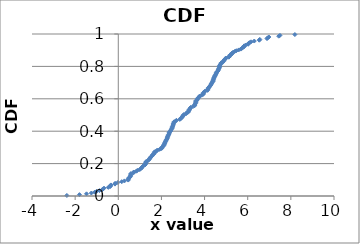
| Category | Series 0 |
|---|---|
| 2.92116049671744 | 0.483 |
| 4.691069828293452 | 0.797 |
| 3.863768191649954 | 0.622 |
| 0.5567508036521236 | 0.118 |
| 4.273871467133709 | 0.682 |
| 2.150887501739766 | 0.323 |
| 4.165580808899719 | 0.662 |
| 2.1759806109620103 | 0.333 |
| 0.584248065636312 | 0.138 |
| 4.663427167355252 | 0.787 |
| 1.13932823841632 | 0.183 |
| 5.582208659082646 | 0.902 |
| 4.966402476722099 | 0.847 |
| 2.5070611897885073 | 0.428 |
| 4.6364468851873095 | 0.777 |
| 2.9798841299689562 | 0.493 |
| 0.5652770093460227 | 0.123 |
| 5.831170378756515 | 0.922 |
| 3.933393813289146 | 0.627 |
| 2.024169018489188 | 0.298 |
| 3.3160073949156876 | 0.537 |
| 5.833778218197992 | 0.927 |
| 3.278588023149046 | 0.527 |
| 5.191456745703304 | 0.872 |
| 1.0379192066807637 | 0.168 |
| 3.240497186148671 | 0.517 |
| 4.510581693709724 | 0.747 |
| 4.5746018217126805 | 0.767 |
| 2.195615193063193 | 0.338 |
| 2.1508908211732214 | 0.328 |
| 6.021421844783063 | 0.937 |
| 6.894848530245525 | 0.972 |
| 2.257755373104324 | 0.353 |
| 0.5836269199614215 | 0.133 |
| -0.14706087765786524 | 0.078 |
| 7.438095384143731 | 0.987 |
| 1.099155956310656 | 0.178 |
| -1.4721609159649667 | 0.013 |
| 1.0830511653679809 | 0.173 |
| 1.2567259820370267 | 0.198 |
| 2.9004865230453065 | 0.478 |
| 3.546072103149542 | 0.562 |
| 1.4455250602531127 | 0.228 |
| 2.087307044682789 | 0.308 |
| 1.6306636417811862 | 0.258 |
| 0.7164946931124785 | 0.148 |
| 3.139100779745818 | 0.507 |
| 3.7757341126813646 | 0.617 |
| 2.2116057600804298 | 0.343 |
| 0.4669297893565316 | 0.103 |
| 0.4755541206145626 | 0.108 |
| 2.2760202060403385 | 0.358 |
| 5.13380779234312 | 0.862 |
| 2.359205979275716 | 0.388 |
| 1.176229760470223 | 0.188 |
| 6.928469794583378 | 0.977 |
| 5.12443700495685 | 0.857 |
| 6.1535315348412105 | 0.952 |
| 3.5913252318110622 | 0.577 |
| 4.770810319080422 | 0.822 |
| 4.2199886468724745 | 0.672 |
| 1.4877126364616697 | 0.238 |
| 1.4662808664144609 | 0.233 |
| 2.4922237811954147 | 0.418 |
| 2.6951878754889393 | 0.468 |
| 2.3123086392213326 | 0.373 |
| -0.35982464877750786 | 0.063 |
| 1.2701922619285848 | 0.203 |
| 6.031034142668977 | 0.942 |
| 0.49690587242163264 | 0.113 |
| 5.903558962852384 | 0.932 |
| 3.5395570305947888 | 0.557 |
| 4.13865468916983 | 0.652 |
| -0.020648072182097188 | 0.083 |
| -1.7998359549250047 | 0.008 |
| 4.4693887548417575 | 0.737 |
| 1.5784021216466093 | 0.253 |
| 4.545131422372471 | 0.757 |
| 2.5813292907676786 | 0.453 |
| 2.555658438847605 | 0.448 |
| 1.2930574234912262 | 0.213 |
| -0.3436070738769388 | 0.068 |
| 4.405155207712659 | 0.717 |
| 4.987031010464293 | 0.852 |
| 3.654631502388395 | 0.592 |
| 3.3596295826415723 | 0.547 |
| 4.23601105947577 | 0.677 |
| 4.415700945695866 | 0.722 |
| 4.547220291052788 | 0.762 |
| 0.4604912926768092 | 0.098 |
| 4.517294694822362 | 0.752 |
| 2.433168957647754 | 0.403 |
| 1.574299307301391 | 0.248 |
| 4.473301741591794 | 0.742 |
| 1.7796305957247052 | 0.278 |
| 3.7088794474267814 | 0.607 |
| 3.2441254621836255 | 0.522 |
| 4.352061565960882 | 0.702 |
| 2.6571600057443785 | 0.463 |
| -2.383727859050225 | 0.003 |
| 2.1171324881772806 | 0.318 |
| 4.75758710088852 | 0.817 |
| -0.7051528609320226 | 0.043 |
| 1.5258669742967315 | 0.243 |
| 0.9960985632590935 | 0.163 |
| 2.3252579080932003 | 0.378 |
| 4.018160433147798 | 0.647 |
| 4.686915741542183 | 0.792 |
| 5.392001084014566 | 0.892 |
| 3.9356716611333944 | 0.632 |
| 4.429839988994797 | 0.727 |
| 2.2926198299336806 | 0.368 |
| 2.5016749251269967 | 0.423 |
| 4.392783547001818 | 0.712 |
| -1.2475852086694506 | 0.018 |
| 1.2742537800050862 | 0.208 |
| 2.582291506563778 | 0.458 |
| 6.560734713391549 | 0.967 |
| 4.882909757493346 | 0.837 |
| 4.3103047849274745 | 0.692 |
| 5.6767152404681696 | 0.907 |
| 2.2327280076308593 | 0.348 |
| 3.1630642202273465 | 0.512 |
| 6.982246817684809 | 0.982 |
| 6.304234455710617 | 0.957 |
| 3.553620951846626 | 0.567 |
| 0.8830154724554564 | 0.158 |
| 3.994440142103867 | 0.642 |
| -1.094880546093222 | 0.023 |
| -0.8737704004936608 | 0.033 |
| 1.6698212496759033 | 0.263 |
| 2.541315794524186 | 0.438 |
| 4.298544686389936 | 0.687 |
| -0.46120078061029 | 0.053 |
| 3.462321238767192 | 0.552 |
| 4.695687036261823 | 0.802 |
| 5.315700755018115 | 0.887 |
| 5.270157060098232 | 0.882 |
| 4.438033928839825 | 0.732 |
| 3.664203784031213 | 0.597 |
| 3.69118842914195 | 0.602 |
| 4.625682695977932 | 0.772 |
| 0.2867695056665065 | 0.093 |
| 4.697131465410832 | 0.807 |
| 2.553221428130547 | 0.443 |
| 1.2526921656023955 | 0.193 |
| 4.639516269720099 | 0.782 |
| 4.389760286091116 | 0.707 |
| 3.5935086859452317 | 0.582 |
| 2.35646011178296 | 0.383 |
| 8.186361752899545 | 0.997 |
| 5.472899846149413 | 0.897 |
| 2.1132910182222107 | 0.313 |
| 3.5946452840347787 | 0.587 |
| 2.8518280306145543 | 0.473 |
| 5.727861055281268 | 0.912 |
| 0.8390154420698979 | 0.153 |
| 4.880875939764219 | 0.832 |
| -1.011742227155926 | 0.028 |
| 5.7765664484790324 | 0.917 |
| 3.5807862912704405 | 0.572 |
| 2.0342997910967564 | 0.303 |
| 1.9151395531072914 | 0.288 |
| 3.2790005170098 | 0.532 |
| 5.1875397742266305 | 0.867 |
| 3.9441288293111194 | 0.637 |
| 1.409042570549885 | 0.223 |
| 0.5719323447650408 | 0.128 |
| 3.341649275063137 | 0.542 |
| 2.2763366662911433 | 0.363 |
| -0.7507226223877259 | 0.038 |
| 3.0332328260049053 | 0.502 |
| 4.145130621610127 | 0.657 |
| 1.6848537208054197 | 0.273 |
| 4.169917540383496 | 0.667 |
| 0.7084160628141323 | 0.143 |
| 0.16146656698029282 | 0.088 |
| 4.740784200015856 | 0.812 |
| 6.082765710586749 | 0.947 |
| 2.527268406322165 | 0.433 |
| 2.970075684811245 | 0.488 |
| 1.3726368083877922 | 0.218 |
| 2.3607669433444585 | 0.393 |
| 1.6712020949410458 | 0.268 |
| 2.463801483552082 | 0.413 |
| 1.8006738789987105 | 0.283 |
| 3.758051994360175 | 0.612 |
| 4.932906977362539 | 0.842 |
| 2.440699600695724 | 0.408 |
| 2.3949178850467585 | 0.398 |
| 6.535622161529051 | 0.962 |
| -0.37120524138604694 | 0.058 |
| 7.494075700808587 | 0.992 |
| -0.15388564287545758 | 0.073 |
| 3.0160798922812293 | 0.498 |
| -0.6613550828002923 | 0.048 |
| 4.8452824989186265 | 0.827 |
| 4.330262145091359 | 0.697 |
| 2.008918746855817 | 0.293 |
| 5.26622116875591 | 0.877 |